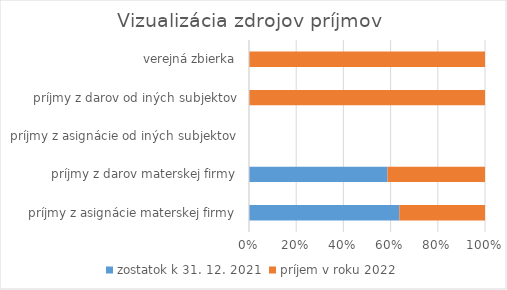
| Category | zostatok k 31. 12. 2021 | príjem v roku 2022 |
|---|---|---|
| príjmy z asignácie materskej firmy | 417384.05 | 237850.53 |
| príjmy z darov materskej firmy | 111636.63 | 78600 |
| príjmy z asignácie od iných subjektov | 0 | 0 |
| príjmy z darov od iných subjektov | 0 | 54780.97 |
| verejná zbierka | 0 | 4466.47 |